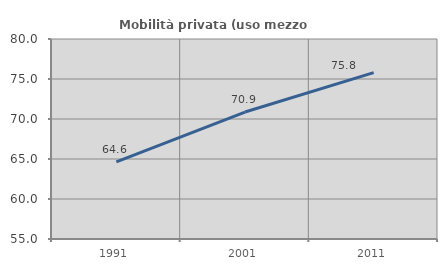
| Category | Mobilità privata (uso mezzo privato) |
|---|---|
| 1991.0 | 64.635 |
| 2001.0 | 70.869 |
| 2011.0 | 75.796 |